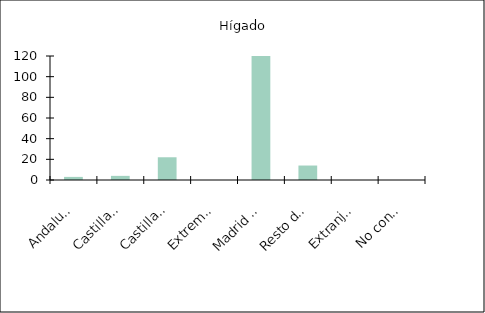
| Category | Hígado |
|---|---|
|    Andalucía | 3 |
|    Castilla y León | 4 |
|    Castilla-La Mancha | 22 |
|    Extremadura | 0 |
|    Madrid (Comunidad de) | 139 |
|    Resto de CCAA | 14 |
|    Extranjero | 0 |
|    No consta | 0 |